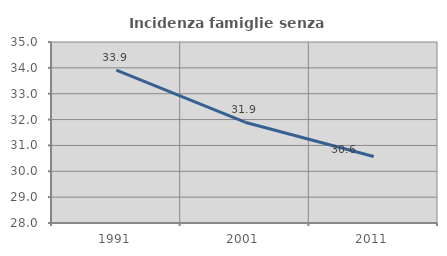
| Category | Incidenza famiglie senza nuclei |
|---|---|
| 1991.0 | 33.916 |
| 2001.0 | 31.898 |
| 2011.0 | 30.571 |